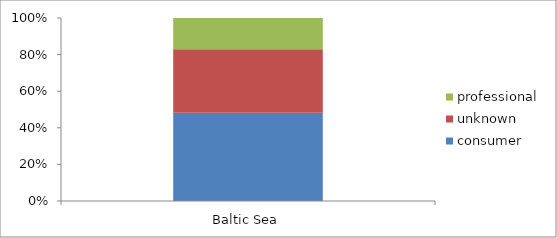
| Category | consumer | unknown | professional |
|---|---|---|---|
| Baltic Sea | 0.482 | 0.347 | 0.171 |